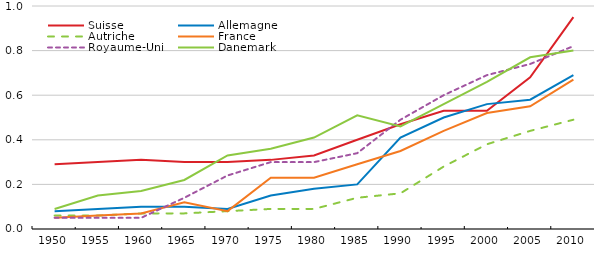
| Category | Suisse | Allemagne | Autriche | France | Royaume-Uni | Danemark |
|---|---|---|---|---|---|---|
| 1950.0 | 0.29 | 0.08 | 0.06 | 0.05 | 0.05 | 0.09 |
| 1955.0 | 0.3 | 0.09 | 0.06 | 0.06 | 0.05 | 0.15 |
| 1960.0 | 0.31 | 0.1 | 0.07 | 0.07 | 0.05 | 0.17 |
| 1965.0 | 0.3 | 0.1 | 0.07 | 0.12 | 0.14 | 0.22 |
| 1970.0 | 0.3 | 0.09 | 0.08 | 0.08 | 0.24 | 0.33 |
| 1975.0 | 0.31 | 0.15 | 0.09 | 0.23 | 0.3 | 0.36 |
| 1980.0 | 0.33 | 0.18 | 0.09 | 0.23 | 0.3 | 0.41 |
| 1985.0 | 0.4 | 0.2 | 0.14 | 0.29 | 0.34 | 0.51 |
| 1990.0 | 0.47 | 0.41 | 0.16 | 0.35 | 0.49 | 0.46 |
| 1995.0 | 0.53 | 0.5 | 0.28 | 0.44 | 0.6 | 0.56 |
| 2000.0 | 0.53 | 0.56 | 0.38 | 0.52 | 0.69 | 0.66 |
| 2005.0 | 0.68 | 0.58 | 0.44 | 0.55 | 0.74 | 0.77 |
| 2010.0 | 0.95 | 0.69 | 0.49 | 0.67 | 0.82 | 0.8 |